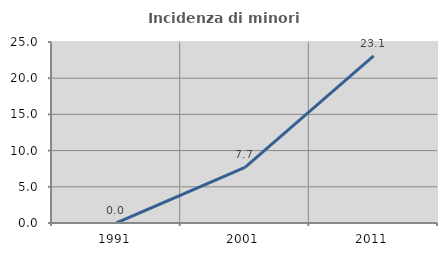
| Category | Incidenza di minori stranieri |
|---|---|
| 1991.0 | 0 |
| 2001.0 | 7.692 |
| 2011.0 | 23.077 |